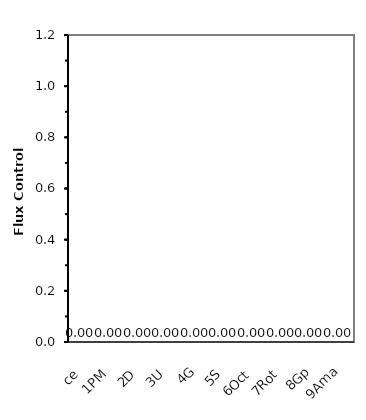
| Category | Flux Control Ratio |
|---|---|
| ce | 0 |
| 1PM | 0 |
| 2D | 0 |
| 3U | 0 |
| 4G | 0 |
| 5S | 0 |
| 6Oct | 0 |
| 7Rot | 0 |
| 8Gp | 0 |
| 9Ama | 0 |